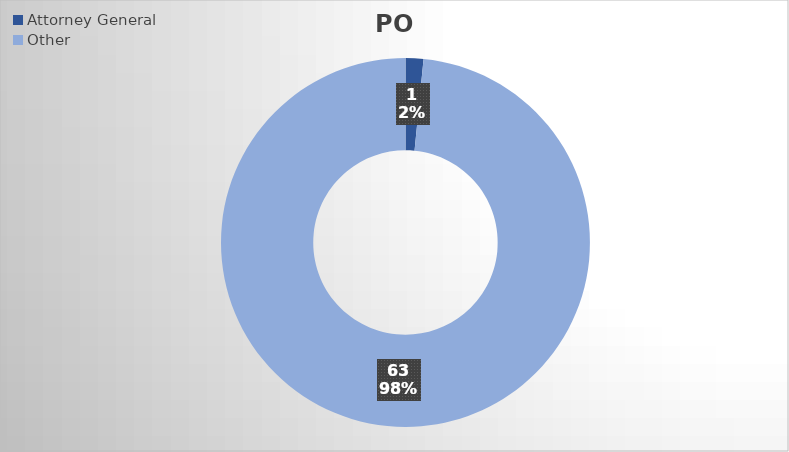
| Category | PO Lines |
|---|---|
| Attorney General | 1 |
| Other | 63 |